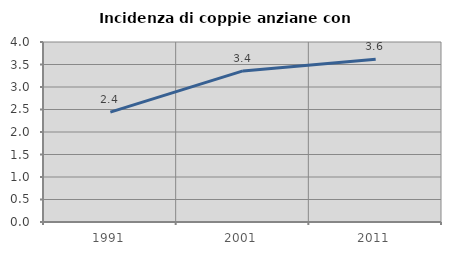
| Category | Incidenza di coppie anziane con figli |
|---|---|
| 1991.0 | 2.442 |
| 2001.0 | 3.358 |
| 2011.0 | 3.619 |